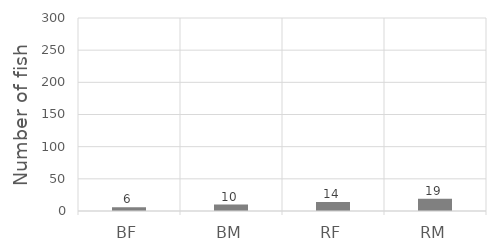
| Category | Series 0 |
|---|---|
| BF | 6 |
| BM | 10 |
| RF | 14 |
| RM | 19 |